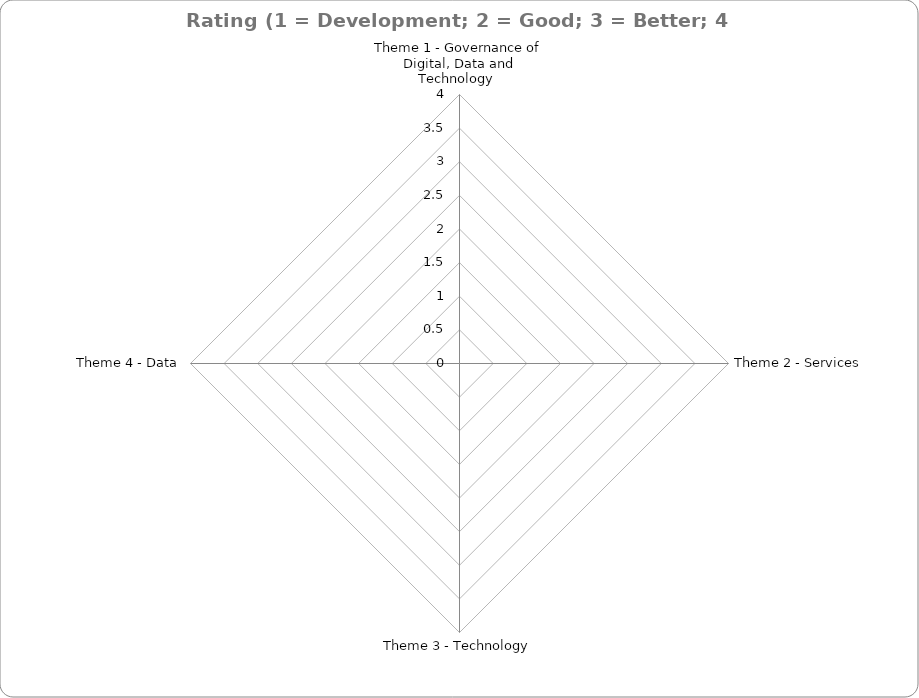
| Category | Series 0 | Series 1 | Series 2 | Series 3 |
|---|---|---|---|---|
| Theme 1 - Governance of Digital, Data and Technology  | 0 | 0 | 0 | 0 |
| Theme 2 - Services | 0 | 0 | 0 | 0 |
| Theme 3 - Technology | 0 | 0 | 0 | 0 |
| Theme 4 - Data | 0 | 0 | 0 | 0 |